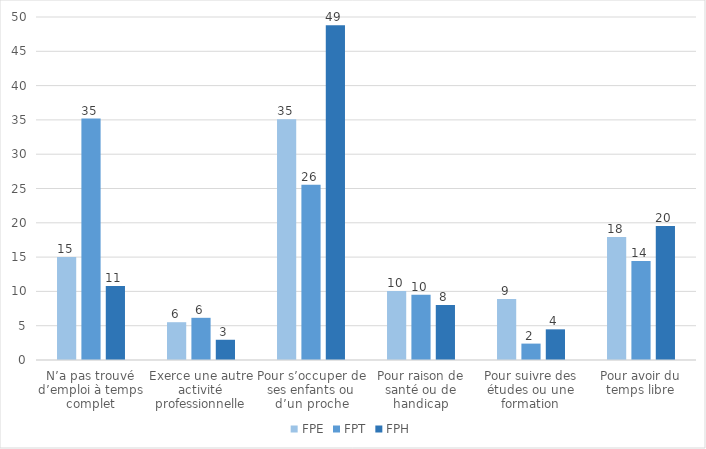
| Category | FPE | FPT | FPH |
|---|---|---|---|
| N’a pas trouvé d’emploi à temps complet | 15 | 35.2 | 10.79 |
| Exerce une autre activité professionnelle | 5.51 | 6.15 | 2.95 |
| Pour s’occuper de ses enfants ou d’un proche | 35.08 | 25.54 | 48.8 |
| Pour raison de santé ou de handicap | 10.07 | 9.51 | 8.03 |
| Pour suivre des études ou une formation | 8.9 | 2.39 | 4.47 |
| Pour avoir du temps libre | 17.92 | 14.43 | 19.55 |